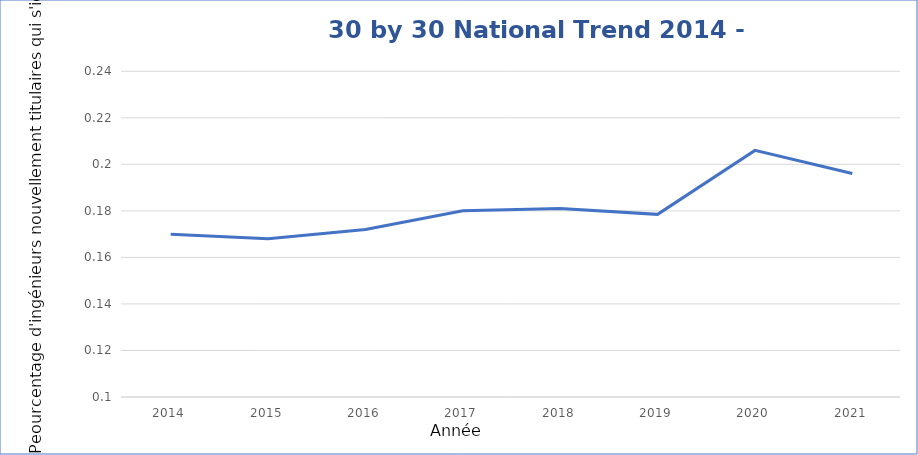
| Category |  Pourcentage national de 30 en 30  |  National 30 by 30 Percentage  |
|---|---|---|
| 2014.0 | 0.17 | 0.17 |
| 2015.0 | 0.168 | 0.168 |
| 2016.0 | 0.172 | 0.172 |
| 2017.0 | 0.18 | 0.18 |
| 2018.0 | 0.181 | 0.181 |
| 2019.0 | 0.178 | 0.178 |
| 2020.0 | 0.206 | 0.206 |
| 2021.0 | 0.198 | 0.196 |